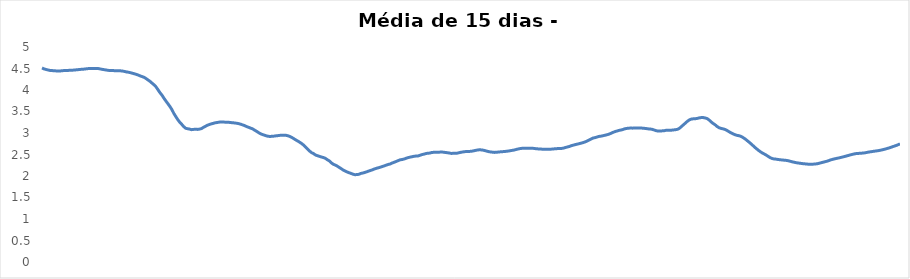
| Category | Series 0 |
|---|---|
| 0 | 4.512 |
| 1 | 4.492 |
| 2 | 4.478 |
| 3 | 4.466 |
| 4 | 4.456 |
| 5 | 4.452 |
| 6 | 4.448 |
| 7 | 4.445 |
| 8 | 4.442 |
| 9 | 4.442 |
| 10 | 4.447 |
| 11 | 4.451 |
| 12 | 4.453 |
| 13 | 4.455 |
| 14 | 4.458 |
| 15 | 4.461 |
| 16 | 4.462 |
| 17 | 4.467 |
| 18 | 4.471 |
| 19 | 4.477 |
| 20 | 4.481 |
| 21 | 4.484 |
| 22 | 4.489 |
| 23 | 4.495 |
| 24 | 4.499 |
| 25 | 4.501 |
| 26 | 4.501 |
| 27 | 4.502 |
| 28 | 4.503 |
| 29 | 4.495 |
| 30 | 4.486 |
| 31 | 4.477 |
| 32 | 4.469 |
| 33 | 4.462 |
| 34 | 4.455 |
| 35 | 4.454 |
| 36 | 4.452 |
| 37 | 4.449 |
| 38 | 4.447 |
| 39 | 4.447 |
| 40 | 4.445 |
| 41 | 4.439 |
| 42 | 4.43 |
| 43 | 4.42 |
| 44 | 4.413 |
| 45 | 4.402 |
| 46 | 4.389 |
| 47 | 4.376 |
| 48 | 4.361 |
| 49 | 4.346 |
| 50 | 4.326 |
| 51 | 4.31 |
| 52 | 4.292 |
| 53 | 4.263 |
| 54 | 4.23 |
| 55 | 4.198 |
| 56 | 4.157 |
| 57 | 4.118 |
| 58 | 4.07 |
| 59 | 4.003 |
| 60 | 3.935 |
| 61 | 3.878 |
| 62 | 3.807 |
| 63 | 3.741 |
| 64 | 3.68 |
| 65 | 3.617 |
| 66 | 3.546 |
| 67 | 3.456 |
| 68 | 3.382 |
| 69 | 3.312 |
| 70 | 3.251 |
| 71 | 3.202 |
| 72 | 3.149 |
| 73 | 3.11 |
| 74 | 3.099 |
| 75 | 3.092 |
| 76 | 3.077 |
| 77 | 3.084 |
| 78 | 3.087 |
| 79 | 3.084 |
| 80 | 3.09 |
| 81 | 3.101 |
| 82 | 3.13 |
| 83 | 3.154 |
| 84 | 3.179 |
| 85 | 3.197 |
| 86 | 3.212 |
| 87 | 3.223 |
| 88 | 3.237 |
| 89 | 3.244 |
| 90 | 3.252 |
| 91 | 3.259 |
| 92 | 3.254 |
| 93 | 3.253 |
| 94 | 3.253 |
| 95 | 3.248 |
| 96 | 3.242 |
| 97 | 3.239 |
| 98 | 3.232 |
| 99 | 3.227 |
| 100 | 3.218 |
| 101 | 3.204 |
| 102 | 3.188 |
| 103 | 3.171 |
| 104 | 3.149 |
| 105 | 3.132 |
| 106 | 3.113 |
| 107 | 3.097 |
| 108 | 3.067 |
| 109 | 3.04 |
| 110 | 3.011 |
| 111 | 2.984 |
| 112 | 2.965 |
| 113 | 2.949 |
| 114 | 2.934 |
| 115 | 2.923 |
| 116 | 2.919 |
| 117 | 2.925 |
| 118 | 2.928 |
| 119 | 2.935 |
| 120 | 2.94 |
| 121 | 2.946 |
| 122 | 2.949 |
| 123 | 2.947 |
| 124 | 2.946 |
| 125 | 2.935 |
| 126 | 2.918 |
| 127 | 2.895 |
| 128 | 2.867 |
| 129 | 2.839 |
| 130 | 2.812 |
| 131 | 2.784 |
| 132 | 2.753 |
| 133 | 2.716 |
| 134 | 2.67 |
| 135 | 2.623 |
| 136 | 2.58 |
| 137 | 2.542 |
| 138 | 2.52 |
| 139 | 2.488 |
| 140 | 2.472 |
| 141 | 2.457 |
| 142 | 2.442 |
| 143 | 2.429 |
| 144 | 2.411 |
| 145 | 2.379 |
| 146 | 2.351 |
| 147 | 2.308 |
| 148 | 2.274 |
| 149 | 2.255 |
| 150 | 2.231 |
| 151 | 2.201 |
| 152 | 2.171 |
| 153 | 2.14 |
| 154 | 2.117 |
| 155 | 2.095 |
| 156 | 2.076 |
| 157 | 2.061 |
| 158 | 2.042 |
| 159 | 2.03 |
| 160 | 2.033 |
| 161 | 2.039 |
| 162 | 2.059 |
| 163 | 2.069 |
| 164 | 2.082 |
| 165 | 2.097 |
| 166 | 2.115 |
| 167 | 2.129 |
| 168 | 2.146 |
| 169 | 2.165 |
| 170 | 2.18 |
| 171 | 2.192 |
| 172 | 2.207 |
| 173 | 2.222 |
| 174 | 2.237 |
| 175 | 2.254 |
| 176 | 2.269 |
| 177 | 2.28 |
| 178 | 2.303 |
| 179 | 2.32 |
| 180 | 2.339 |
| 181 | 2.358 |
| 182 | 2.376 |
| 183 | 2.383 |
| 184 | 2.395 |
| 185 | 2.411 |
| 186 | 2.427 |
| 187 | 2.438 |
| 188 | 2.448 |
| 189 | 2.458 |
| 190 | 2.464 |
| 191 | 2.466 |
| 192 | 2.48 |
| 193 | 2.497 |
| 194 | 2.507 |
| 195 | 2.52 |
| 196 | 2.53 |
| 197 | 2.532 |
| 198 | 2.546 |
| 199 | 2.55 |
| 200 | 2.552 |
| 201 | 2.555 |
| 202 | 2.555 |
| 203 | 2.558 |
| 204 | 2.554 |
| 205 | 2.547 |
| 206 | 2.542 |
| 207 | 2.535 |
| 208 | 2.525 |
| 209 | 2.527 |
| 210 | 2.529 |
| 211 | 2.531 |
| 212 | 2.543 |
| 213 | 2.552 |
| 214 | 2.56 |
| 215 | 2.566 |
| 216 | 2.57 |
| 217 | 2.572 |
| 218 | 2.574 |
| 219 | 2.582 |
| 220 | 2.592 |
| 221 | 2.602 |
| 222 | 2.608 |
| 223 | 2.608 |
| 224 | 2.602 |
| 225 | 2.592 |
| 226 | 2.579 |
| 227 | 2.567 |
| 228 | 2.558 |
| 229 | 2.554 |
| 230 | 2.549 |
| 231 | 2.552 |
| 232 | 2.559 |
| 233 | 2.562 |
| 234 | 2.566 |
| 235 | 2.57 |
| 236 | 2.575 |
| 237 | 2.58 |
| 238 | 2.589 |
| 239 | 2.596 |
| 240 | 2.605 |
| 241 | 2.618 |
| 242 | 2.628 |
| 243 | 2.638 |
| 244 | 2.644 |
| 245 | 2.647 |
| 246 | 2.645 |
| 247 | 2.644 |
| 248 | 2.646 |
| 249 | 2.646 |
| 250 | 2.641 |
| 251 | 2.635 |
| 252 | 2.631 |
| 253 | 2.627 |
| 254 | 2.625 |
| 255 | 2.624 |
| 256 | 2.623 |
| 257 | 2.623 |
| 258 | 2.623 |
| 259 | 2.625 |
| 260 | 2.63 |
| 261 | 2.633 |
| 262 | 2.638 |
| 263 | 2.638 |
| 264 | 2.641 |
| 265 | 2.649 |
| 266 | 2.663 |
| 267 | 2.675 |
| 268 | 2.687 |
| 269 | 2.705 |
| 270 | 2.718 |
| 271 | 2.73 |
| 272 | 2.741 |
| 273 | 2.752 |
| 274 | 2.764 |
| 275 | 2.777 |
| 276 | 2.793 |
| 277 | 2.813 |
| 278 | 2.837 |
| 279 | 2.86 |
| 280 | 2.882 |
| 281 | 2.892 |
| 282 | 2.905 |
| 283 | 2.92 |
| 284 | 2.926 |
| 285 | 2.936 |
| 286 | 2.947 |
| 287 | 2.958 |
| 288 | 2.972 |
| 289 | 2.99 |
| 290 | 3.012 |
| 291 | 3.029 |
| 292 | 3.044 |
| 293 | 3.058 |
| 294 | 3.067 |
| 295 | 3.078 |
| 296 | 3.096 |
| 297 | 3.105 |
| 298 | 3.112 |
| 299 | 3.114 |
| 300 | 3.113 |
| 301 | 3.115 |
| 302 | 3.114 |
| 303 | 3.116 |
| 304 | 3.117 |
| 305 | 3.113 |
| 306 | 3.109 |
| 307 | 3.103 |
| 308 | 3.096 |
| 309 | 3.094 |
| 310 | 3.086 |
| 311 | 3.072 |
| 312 | 3.055 |
| 313 | 3.045 |
| 314 | 3.045 |
| 315 | 3.049 |
| 316 | 3.051 |
| 317 | 3.062 |
| 318 | 3.065 |
| 319 | 3.064 |
| 320 | 3.066 |
| 321 | 3.072 |
| 322 | 3.078 |
| 323 | 3.087 |
| 324 | 3.112 |
| 325 | 3.153 |
| 326 | 3.193 |
| 327 | 3.233 |
| 328 | 3.274 |
| 329 | 3.306 |
| 330 | 3.324 |
| 331 | 3.33 |
| 332 | 3.332 |
| 333 | 3.34 |
| 334 | 3.352 |
| 335 | 3.359 |
| 336 | 3.359 |
| 337 | 3.35 |
| 338 | 3.335 |
| 339 | 3.302 |
| 340 | 3.259 |
| 341 | 3.223 |
| 342 | 3.193 |
| 343 | 3.153 |
| 344 | 3.124 |
| 345 | 3.107 |
| 346 | 3.097 |
| 347 | 3.084 |
| 348 | 3.061 |
| 349 | 3.034 |
| 350 | 3.006 |
| 351 | 2.983 |
| 352 | 2.963 |
| 353 | 2.947 |
| 354 | 2.938 |
| 355 | 2.925 |
| 356 | 2.901 |
| 357 | 2.872 |
| 358 | 2.836 |
| 359 | 2.799 |
| 360 | 2.76 |
| 361 | 2.719 |
| 362 | 2.676 |
| 363 | 2.637 |
| 364 | 2.599 |
| 365 | 2.567 |
| 366 | 2.537 |
| 367 | 2.512 |
| 368 | 2.487 |
| 369 | 2.456 |
| 370 | 2.427 |
| 371 | 2.407 |
| 372 | 2.395 |
| 373 | 2.392 |
| 374 | 2.384 |
| 375 | 2.378 |
| 376 | 2.374 |
| 377 | 2.368 |
| 378 | 2.365 |
| 379 | 2.357 |
| 380 | 2.346 |
| 381 | 2.332 |
| 382 | 2.322 |
| 383 | 2.312 |
| 384 | 2.304 |
| 385 | 2.297 |
| 386 | 2.291 |
| 387 | 2.285 |
| 388 | 2.281 |
| 389 | 2.276 |
| 390 | 2.273 |
| 391 | 2.271 |
| 392 | 2.276 |
| 393 | 2.28 |
| 394 | 2.286 |
| 395 | 2.297 |
| 396 | 2.31 |
| 397 | 2.321 |
| 398 | 2.333 |
| 399 | 2.345 |
| 400 | 2.362 |
| 401 | 2.378 |
| 402 | 2.39 |
| 403 | 2.401 |
| 404 | 2.412 |
| 405 | 2.42 |
| 406 | 2.432 |
| 407 | 2.443 |
| 408 | 2.455 |
| 409 | 2.469 |
| 410 | 2.48 |
| 411 | 2.495 |
| 412 | 2.505 |
| 413 | 2.516 |
| 414 | 2.523 |
| 415 | 2.526 |
| 416 | 2.53 |
| 417 | 2.533 |
| 418 | 2.538 |
| 419 | 2.547 |
| 420 | 2.556 |
| 421 | 2.563 |
| 422 | 2.57 |
| 423 | 2.577 |
| 424 | 2.583 |
| 425 | 2.59 |
| 426 | 2.599 |
| 427 | 2.609 |
| 428 | 2.621 |
| 429 | 2.633 |
| 430 | 2.647 |
| 431 | 2.66 |
| 432 | 2.678 |
| 433 | 2.693 |
| 434 | 2.708 |
| 435 | 2.727 |
| 436 | 2.746 |